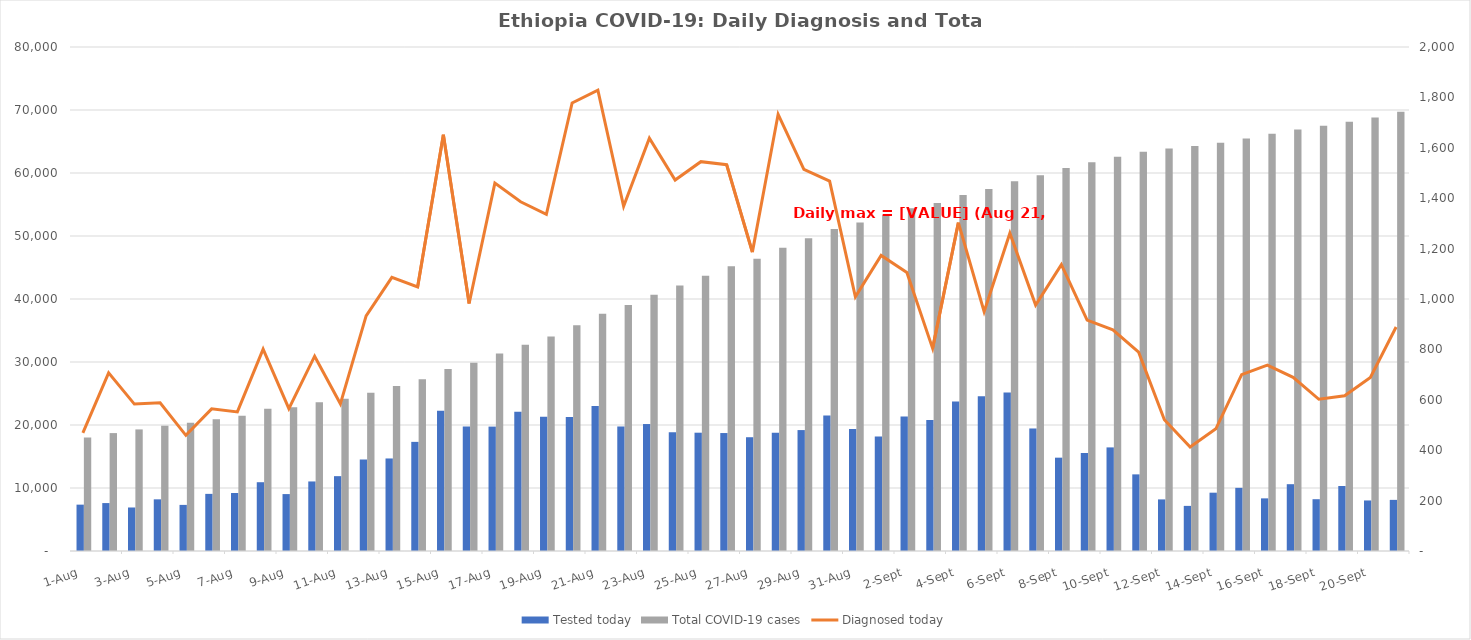
| Category | Tested today | Total COVID-19 cases |
|---|---|---|
| 2020-09-21 | 8115 | 69709 |
| 2020-09-20 | 8023 | 68820 |
| 2020-09-19 | 10322 | 68131 |
| 2020-09-18 | 8221 | 67515 |
| 2020-09-17 | 10605 | 66913 |
| 2020-09-16 | 8355 | 66224 |
| 2020-09-15 | 10024 | 65486 |
| 2020-09-14 | 9256 | 64786 |
| 2020-09-13 | 7162 | 64301 |
| 2020-09-12 | 8191 | 63888 |
| 2020-09-11 | 12164 | 63367 |
| 2020-09-10 | 16445 | 62578 |
| 2020-09-09 | 15561 | 61700 |
| 2020-09-08 | 14815 | 60784 |
| 2020-09-07 | 19449 | 59648 |
| 2020-09-06 | 25158 | 58672 |
| 2020-09-05 | 24544 | 57466 |
| 2020-09-04 | 23712 | 56526 |
| 2020-09-03 | 20778 | 55223 |
| 2020-09-02 | 21360 | 54409 |
| 2020-09-01 | 18160 | 53304 |
| 2020-08-31 | 19364 | 52131 |
| 2020-08-30 | 21499 | 51122 |
| 2020-08-29 | 19194 | 49654 |
| 2020-08-28 | 18766 | 48140 |
| 2020-08-27 | 18060 | 46407 |
| 2020-08-26 | 18724 | 45211 |
| 2020-08-25 | 18778 | 43698 |
| 2020-08-24 | 18851 | 42153 |
| 2020-08-23 | 20153 | 40681 |
| 2020-08-22 | 19766 | 39044 |
| 2020-08-21 | 23035 | 37675 |
| 2020-08-20 | 21256 | 35846 |
| 2020-08-19 | 21326 | 34058 |
| 2020-08-18 | 22101 | 32732 |
| 2020-08-17 | 19747 | 31346 |
| 2020-08-16 | 19767 | 29876 |
| 2020-08-15 | 22252 | 28904 |
| 2020-08-14 | 17323 | 27252 |
| 2020-08-13 | 14688 | 26204 |
| 2020-08-12 | 14540 | 25118 |
| 2020-08-11 | 11881 | 24185 |
| 2020-08-10 | 11039 | 23601 |
| 2020-08-09 | 9035 | 22828 |
| 2020-08-08 | 10919 | 22563 |
| 2020-08-07 | 9203 | 21462 |
| 2020-08-06 | 9068 | 20910 |
| 2020-08-05 | 7319 | 20346 |
| 2020-08-04 | 8201 | 19887 |
| 2020-08-03 | 6907 | 19299 |
| 2020-08-02 | 7607 | 18716 |
| 2020-08-01 | 7358 | 18009 |